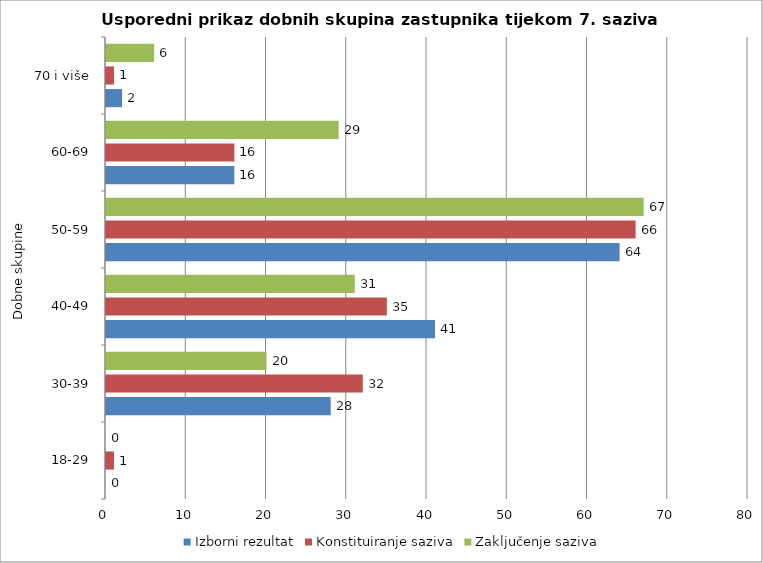
| Category | Izborni rezultat | Konstituiranje saziva | Zaključenje saziva |
|---|---|---|---|
| 18-29 | 0 | 1 | 0 |
| 30-39 | 28 | 32 | 20 |
| 40-49 | 41 | 35 | 31 |
| 50-59 | 64 | 66 | 67 |
| 60-69 | 16 | 16 | 29 |
| 70 i više | 2 | 1 | 6 |